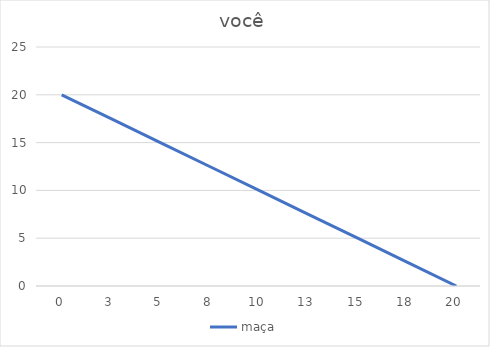
| Category | maça |
|---|---|
| 0.0 | 20 |
| 2.5 | 17.5 |
| 5.0 | 15 |
| 7.5 | 12.5 |
| 10.0 | 10 |
| 12.5 | 7.5 |
| 15.0 | 5 |
| 17.5 | 2.5 |
| 20.0 | 0 |